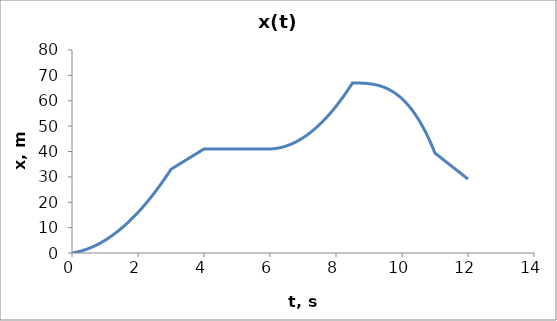
| Category | x(t) |
|---|---|
| 0.0 | 0 |
| 0.1 | 0.23 |
| 0.2 | 0.52 |
| 0.30000000000000004 | 0.87 |
| 0.4 | 1.28 |
| 0.5 | 1.75 |
| 0.6 | 2.28 |
| 0.7 | 2.87 |
| 0.7999999999999999 | 3.52 |
| 0.8999999999999999 | 4.23 |
| 0.9999999999999999 | 5 |
| 1.0999999999999999 | 5.83 |
| 1.2 | 6.72 |
| 1.3 | 7.67 |
| 1.4000000000000001 | 8.68 |
| 1.5000000000000002 | 9.75 |
| 1.6000000000000003 | 10.88 |
| 1.7000000000000004 | 12.07 |
| 1.8000000000000005 | 13.32 |
| 1.9000000000000006 | 14.63 |
| 2.0000000000000004 | 16 |
| 2.1000000000000005 | 17.43 |
| 2.2000000000000006 | 18.92 |
| 2.3000000000000007 | 20.47 |
| 2.400000000000001 | 22.08 |
| 2.500000000000001 | 23.75 |
| 2.600000000000001 | 25.48 |
| 2.700000000000001 | 27.27 |
| 2.800000000000001 | 29.12 |
| 2.9000000000000012 | 31.03 |
| 3.0000000000000013 | 33 |
| 3.1000000000000014 | 33.8 |
| 3.2000000000000015 | 34.6 |
| 3.3000000000000016 | 35.4 |
| 3.4000000000000017 | 36.2 |
| 3.5000000000000018 | 37 |
| 3.600000000000002 | 37.8 |
| 3.700000000000002 | 38.6 |
| 3.800000000000002 | 39.4 |
| 3.900000000000002 | 40.2 |
| 4.000000000000002 | 41 |
| 4.100000000000001 | 41 |
| 4.200000000000001 | 41 |
| 4.300000000000001 | 41 |
| 4.4 | 41 |
| 4.5 | 41 |
| 4.6 | 41 |
| 4.699999999999999 | 41 |
| 4.799999999999999 | 41 |
| 4.899999999999999 | 41 |
| 4.999999999999998 | 41 |
| 5.099999999999998 | 41 |
| 5.1999999999999975 | 41 |
| 5.299999999999997 | 41 |
| 5.399999999999997 | 41 |
| 5.4999999999999964 | 41 |
| 5.599999999999996 | 41 |
| 5.699999999999996 | 41 |
| 5.799999999999995 | 41 |
| 5.899999999999995 | 41 |
| 5.999999999999995 | 41 |
| 6.099999999999994 | 41.08 |
| 6.199999999999994 | 41.24 |
| 6.299999999999994 | 41.48 |
| 6.399999999999993 | 41.8 |
| 6.499999999999993 | 42.2 |
| 6.5999999999999925 | 42.68 |
| 6.699999999999992 | 43.24 |
| 6.799999999999992 | 43.88 |
| 6.8999999999999915 | 44.6 |
| 6.999999999999991 | 45.4 |
| 7.099999999999991 | 46.28 |
| 7.19999999999999 | 47.24 |
| 7.29999999999999 | 48.28 |
| 7.39999999999999 | 49.4 |
| 7.499999999999989 | 50.6 |
| 7.599999999999989 | 51.88 |
| 7.699999999999989 | 53.24 |
| 7.799999999999988 | 54.68 |
| 7.899999999999988 | 56.2 |
| 7.999999999999988 | 57.8 |
| 8.099999999999987 | 59.48 |
| 8.199999999999987 | 61.24 |
| 8.299999999999986 | 63.08 |
| 8.399999999999986 | 65 |
| 8.499999999999986 | 67 |
| 8.599999999999985 | 66.995 |
| 8.699999999999985 | 66.975 |
| 8.799999999999985 | 66.93 |
| 8.899999999999984 | 66.85 |
| 8.999999999999984 | 66.725 |
| 9.099999999999984 | 66.545 |
| 9.199999999999983 | 66.3 |
| 9.299999999999983 | 65.98 |
| 9.399999999999983 | 65.575 |
| 9.499999999999982 | 65.075 |
| 9.599999999999982 | 64.47 |
| 9.699999999999982 | 63.75 |
| 9.799999999999981 | 62.905 |
| 9.89999999999998 | 61.925 |
| 9.99999999999998 | 60.8 |
| 10.09999999999998 | 59.52 |
| 10.19999999999998 | 58.075 |
| 10.29999999999998 | 56.455 |
| 10.399999999999979 | 54.65 |
| 10.499999999999979 | 52.65 |
| 10.599999999999978 | 50.445 |
| 10.699999999999978 | 48.025 |
| 10.799999999999978 | 45.38 |
| 10.899999999999977 | 42.5 |
| 10.999999999999977 | 39.375 |
| 11.099999999999977 | 38.35 |
| 11.199999999999976 | 37.325 |
| 11.299999999999976 | 36.3 |
| 11.399999999999975 | 35.275 |
| 11.499999999999975 | 34.25 |
| 11.599999999999975 | 33.225 |
| 11.699999999999974 | 32.2 |
| 11.799999999999974 | 31.175 |
| 11.899999999999974 | 30.15 |
| 11.999999999999973 | 29.125 |